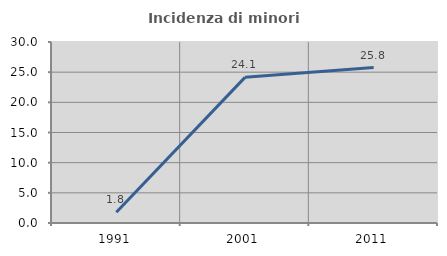
| Category | Incidenza di minori stranieri |
|---|---|
| 1991.0 | 1.786 |
| 2001.0 | 24.138 |
| 2011.0 | 25.758 |